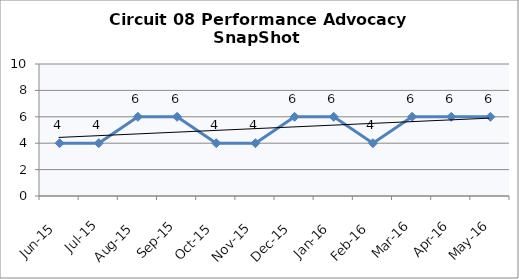
| Category | Circuit 08 |
|---|---|
| Jun-15 | 4 |
| Jul-15 | 4 |
| Aug-15 | 6 |
| Sep-15 | 6 |
| Oct-15 | 4 |
| Nov-15 | 4 |
| Dec-15 | 6 |
| Jan-16 | 6 |
| Feb-16 | 4 |
| Mar-16 | 6 |
| Apr-16 | 6 |
| May-16 | 6 |